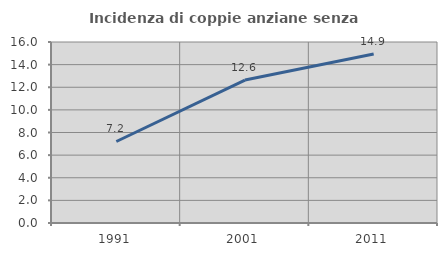
| Category | Incidenza di coppie anziane senza figli  |
|---|---|
| 1991.0 | 7.206 |
| 2001.0 | 12.636 |
| 2011.0 | 14.942 |